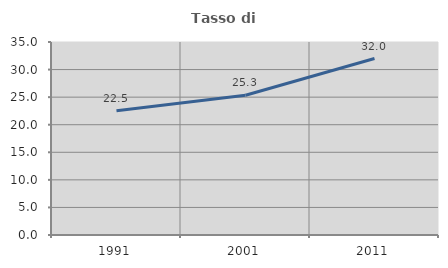
| Category | Tasso di occupazione   |
|---|---|
| 1991.0 | 22.517 |
| 2001.0 | 25.345 |
| 2011.0 | 32.005 |